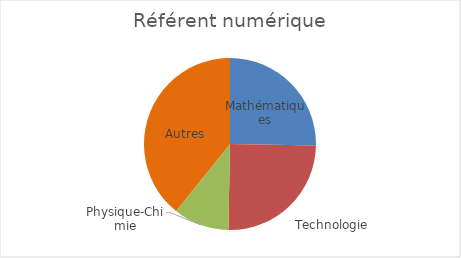
| Category | Référent numérique |
|---|---|
| Mathématiques | 0.253 |
| Technologie | 0.25 |
| Physique-Chimie | 0.105 |
| Autres | 0.392 |